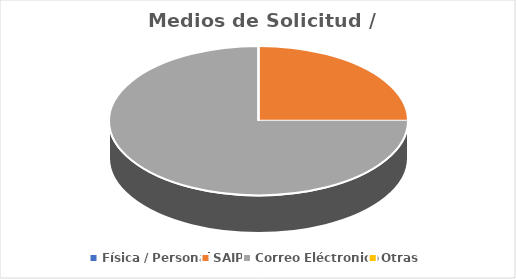
| Category | Series 0 |
|---|---|
| Física / Personal | 0 |
| SAIP | 1 |
| Correo Eléctronico | 3 |
| Otras | 0 |